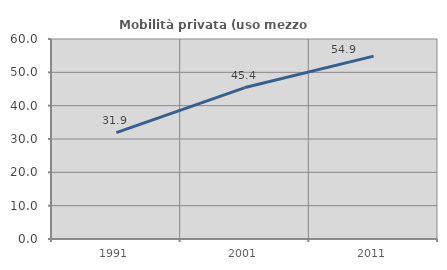
| Category | Mobilità privata (uso mezzo privato) |
|---|---|
| 1991.0 | 31.893 |
| 2001.0 | 45.429 |
| 2011.0 | 54.875 |